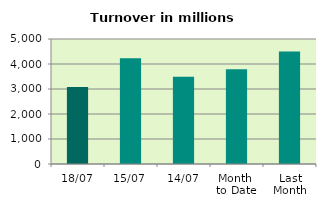
| Category | Series 0 |
|---|---|
| 18/07 | 3079.229 |
| 15/07 | 4231.958 |
| 14/07 | 3494.581 |
| Month 
to Date | 3792.557 |
| Last
Month | 4502.251 |